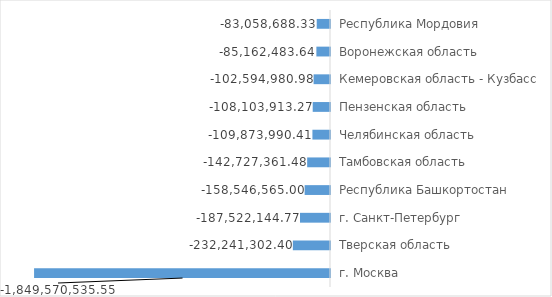
| Category | 2018 год |
|---|---|
| Республика Мордовия | -83058688.33 |
| Воронежская область | -85162483.64 |
| Кемеровская область - Кузбасс | -102594980.98 |
| Пензенская область | -108103913.27 |
| Челябинская область | -109873990.41 |
| Тамбовская область | -142727361.48 |
| Республика Башкортостан | -158546565 |
| г. Санкт-Петербург | -187522144.77 |
| Тверская область | -232241302.4 |
| г. Москва | -1849570535.55 |